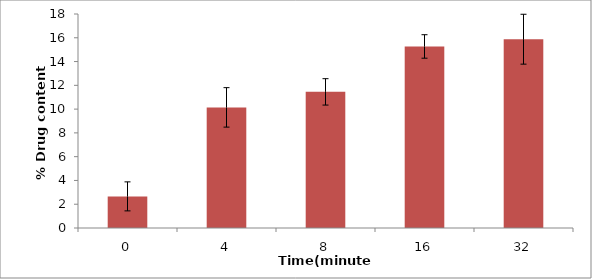
| Category | drug |
|---|---|
| 0.0 | 2.66 |
| 4.0 | 10.145 |
| 8.0 | 11.45 |
| 16.0 | 15.27 |
| 32.0 | 15.88 |